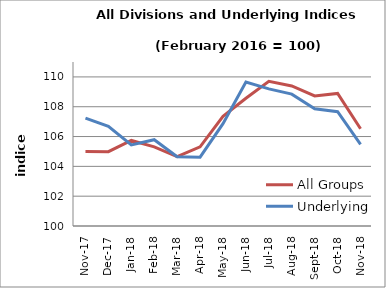
| Category | All Groups | Underlying |
|---|---|---|
| 2017-11-01 | 104.991 | 107.237 |
| 2017-12-01 | 104.983 | 106.688 |
| 2018-01-01 | 105.739 | 105.443 |
| 2018-02-01 | 105.308 | 105.79 |
| 2018-03-01 | 104.655 | 104.651 |
| 2018-04-01 | 105.309 | 104.614 |
| 2018-05-01 | 107.355 | 106.863 |
| 2018-06-01 | 108.567 | 109.659 |
| 2018-07-01 | 109.702 | 109.198 |
| 2018-08-01 | 109.392 | 108.845 |
| 2018-09-01 | 108.722 | 107.857 |
| 2018-10-01 | 108.895 | 107.664 |
| 2018-11-01 | 106.524 | 105.471 |